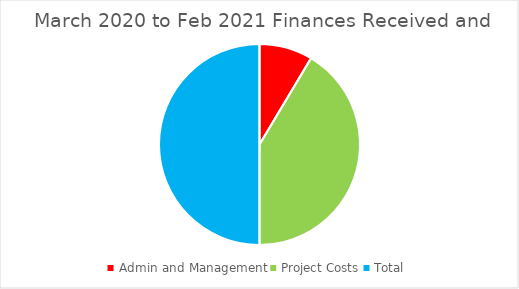
| Category | Series 0 | Series 1 | Series 2 |
|---|---|---|---|
| Admin and Management | 363076 | 363076 | 18 |
| Project Costs | 1755924 | 1755924 | 82 |
| Total | 2119000 | 2119000 | 100 |